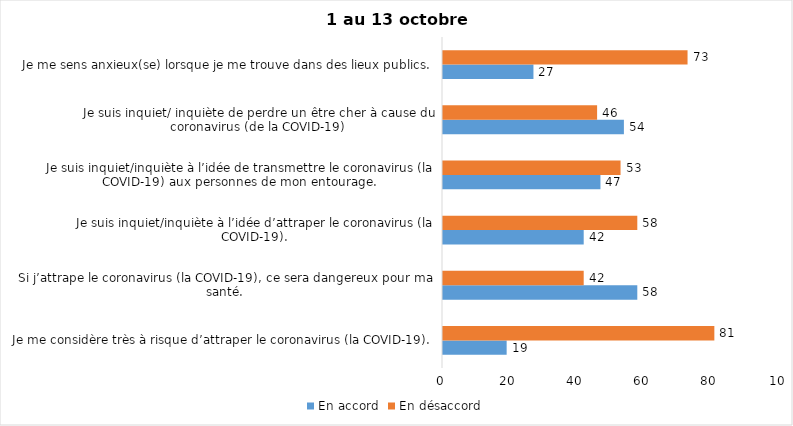
| Category | En accord | En désaccord |
|---|---|---|
| Je me considère très à risque d’attraper le coronavirus (la COVID-19). | 19 | 81 |
| Si j’attrape le coronavirus (la COVID-19), ce sera dangereux pour ma santé. | 58 | 42 |
| Je suis inquiet/inquiète à l’idée d’attraper le coronavirus (la COVID-19). | 42 | 58 |
| Je suis inquiet/inquiète à l’idée de transmettre le coronavirus (la COVID-19) aux personnes de mon entourage. | 47 | 53 |
| Je suis inquiet/ inquiète de perdre un être cher à cause du coronavirus (de la COVID-19) | 54 | 46 |
| Je me sens anxieux(se) lorsque je me trouve dans des lieux publics. | 27 | 73 |